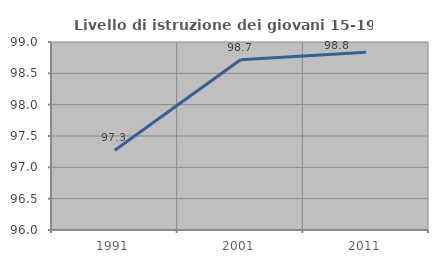
| Category | Livello di istruzione dei giovani 15-19 anni |
|---|---|
| 1991.0 | 97.273 |
| 2001.0 | 98.718 |
| 2011.0 | 98.837 |